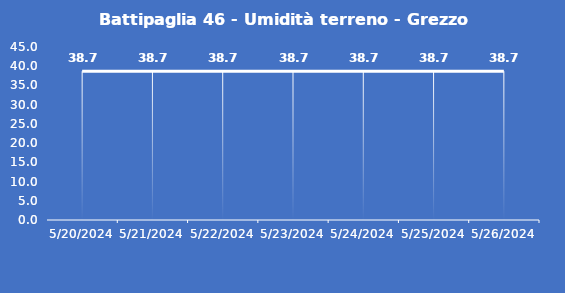
| Category | Battipaglia 46 - Umidità terreno - Grezzo (%VWC) |
|---|---|
| 5/20/24 | 38.7 |
| 5/21/24 | 38.7 |
| 5/22/24 | 38.7 |
| 5/23/24 | 38.7 |
| 5/24/24 | 38.7 |
| 5/25/24 | 38.7 |
| 5/26/24 | 38.7 |